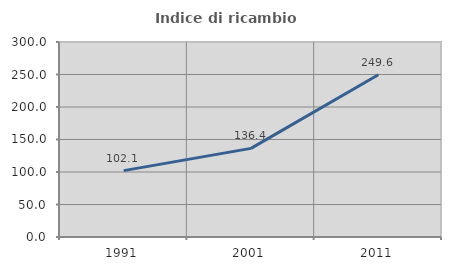
| Category | Indice di ricambio occupazionale  |
|---|---|
| 1991.0 | 102.098 |
| 2001.0 | 136.364 |
| 2011.0 | 249.597 |